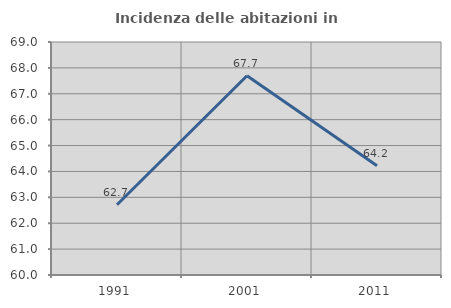
| Category | Incidenza delle abitazioni in proprietà  |
|---|---|
| 1991.0 | 62.715 |
| 2001.0 | 67.695 |
| 2011.0 | 64.224 |